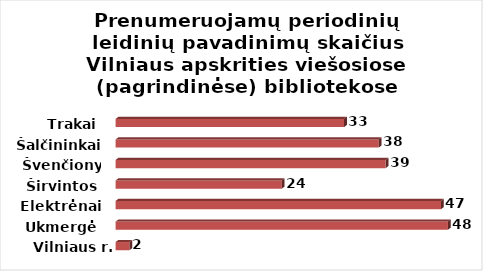
| Category | Series 0 |
|---|---|
| Vilniaus r. | 2 |
| Ukmergė | 48 |
| Elektrėnai | 47 |
| Širvintos | 24 |
| Švenčionys | 39 |
| Šalčininkai | 38 |
| Trakai | 33 |